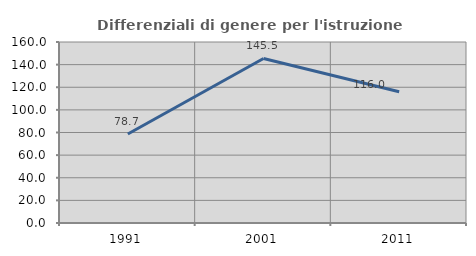
| Category | Differenziali di genere per l'istruzione superiore |
|---|---|
| 1991.0 | 78.673 |
| 2001.0 | 145.455 |
| 2011.0 | 115.966 |